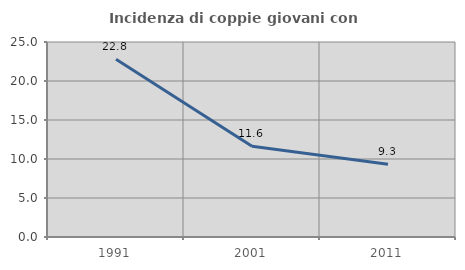
| Category | Incidenza di coppie giovani con figli |
|---|---|
| 1991.0 | 22.789 |
| 2001.0 | 11.636 |
| 2011.0 | 9.328 |